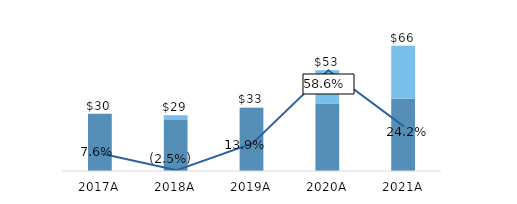
| Category | Series 3 | Series 4 | Series 5 |
|---|---|---|---|
| 2017.0 | 30.106 | 0 | 30.106 |
| 2018.0 | 26.835 | 2.518 | 29.353 |
| 2019.0 | 33.144 | 0.295 | 33.439 |
| 2020.0 | 35.462 | 17.584 | 53.046 |
| 2021.0 | 38.033 | 27.829 | 65.862 |